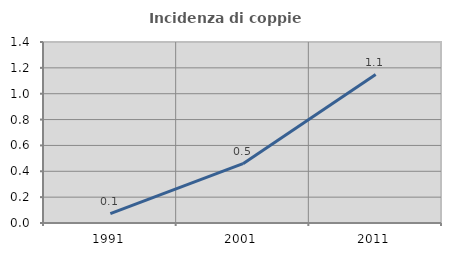
| Category | Incidenza di coppie miste |
|---|---|
| 1991.0 | 0.073 |
| 2001.0 | 0.459 |
| 2011.0 | 1.148 |